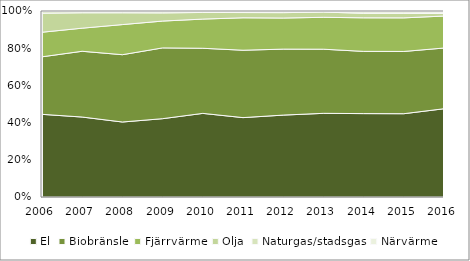
| Category | El | Biobränsle | Fjärrvärme | Olja | Naturgas/stadsgas | Närvärme |
|---|---|---|---|---|---|---|
| 2006 | 0.447 | 0.311 | 0.133 | 0.103 | 0.009 | 0.003 |
| 2007 | 0.43 | 0.354 | 0.124 | 0.083 | 0.006 | 0.003 |
| 2008 | 0.403 | 0.362 | 0.162 | 0.063 | 0.006 | 0.003 |
| 2009 | 0.421 | 0.381 | 0.144 | 0.044 | 0.006 | 0.004 |
| 2010 | 0.45 | 0.35 | 0.157 | 0.036 | 0.006 | 0.002 |
| 2011 | 0.427 | 0.362 | 0.174 | 0.028 | 0.004 | 0.005 |
| 2012 | 0.44 | 0.355 | 0.167 | 0.029 | 0.005 | 0.004 |
| 2013 | 0.45 | 0.345 | 0.172 | 0.028 | 0.003 | 0.003 |
| 2014 | 0.448 | 0.335 | 0.18 | 0.024 | 0.008 | 0.005 |
| 2015 | 0.448 | 0.335 | 0.181 | 0.024 | 0.008 | 0.005 |
| 2016 | 0.475 | 0.326 | 0.172 | 0.013 | 0.008 | 0.006 |